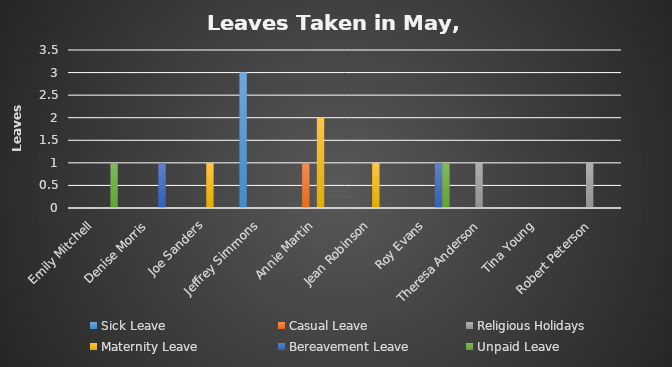
| Category | Sick Leave | Casual Leave | Religious Holidays | Maternity Leave | Bereavement Leave | Unpaid Leave |
|---|---|---|---|---|---|---|
| Emily Mitchell | 0 | 0 | 0 | 0 | 0 | 1 |
| Denise Morris | 0 | 0 | 0 | 0 | 1 | 0 |
| Joe Sanders | 0 | 0 | 0 | 1 | 0 | 0 |
| Jeffrey Simmons | 3 | 0 | 0 | 0 | 0 | 0 |
| Annie Martin | 0 | 1 | 0 | 2 | 0 | 0 |
| Jean Robinson | 0 | 0 | 0 | 1 | 0 | 0 |
| Roy Evans | 0 | 0 | 0 | 0 | 1 | 1 |
| Theresa Anderson | 0 | 0 | 1 | 0 | 0 | 0 |
| Tina Young | 0 | 0 | 0 | 0 | 0 | 0 |
| Robert Peterson | 0 | 0 | 1 | 0 | 0 | 0 |